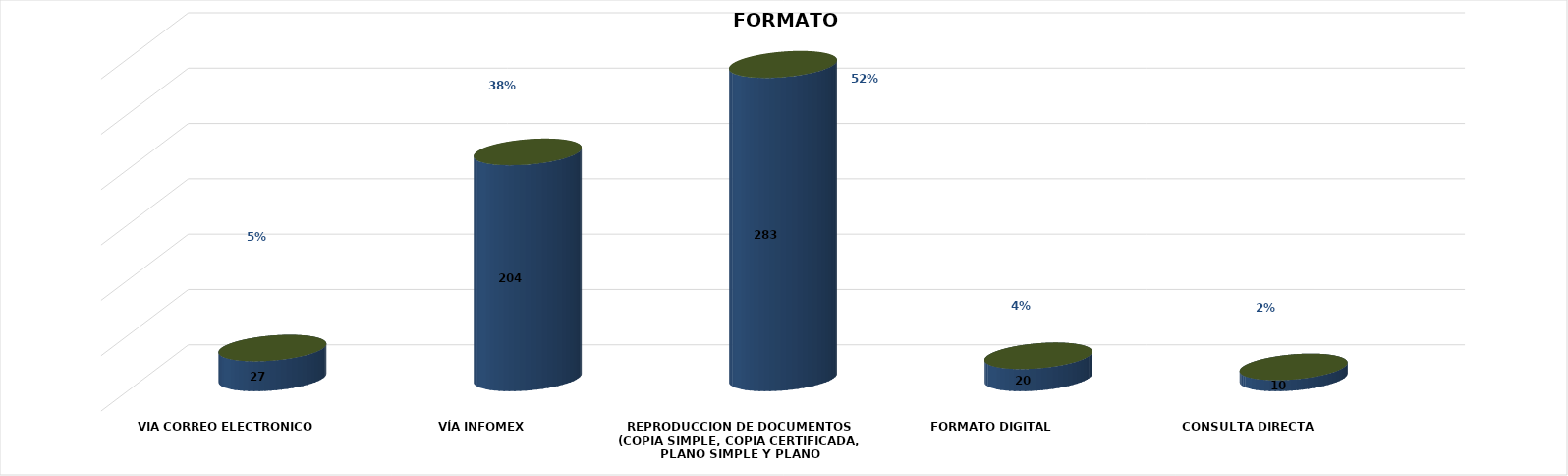
| Category | Series 0 | Series 1 | Series 2 | Series 3 | Series 4 |
|---|---|---|---|---|---|
| VIA CORREO ELECTRONICO |  |  |  | 27 | 0.05 |
| VÍA INFOMEX |  |  |  | 204 | 0.375 |
| REPRODUCCION DE DOCUMENTOS (COPIA SIMPLE, COPIA CERTIFICADA, PLANO SIMPLE Y PLANO CERTIFICADO) |  |  |  | 283 | 0.52 |
| FORMATO DIGITAL |  |  |  | 20 | 0.037 |
| CONSULTA DIRECTA |  |  |  | 10 | 0.018 |